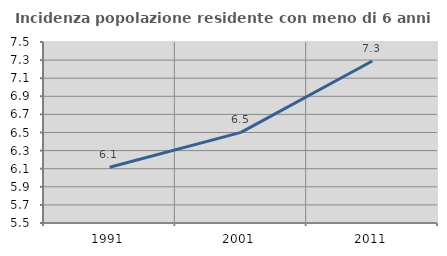
| Category | Incidenza popolazione residente con meno di 6 anni |
|---|---|
| 1991.0 | 6.116 |
| 2001.0 | 6.502 |
| 2011.0 | 7.29 |